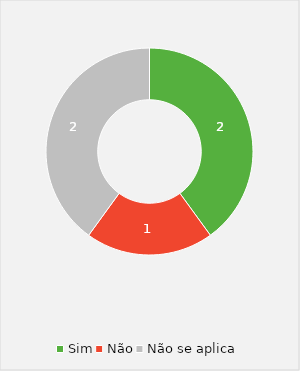
| Category | Series 0 |
|---|---|
| Sim | 2 |
| Não | 1 |
| Não se aplica | 2 |